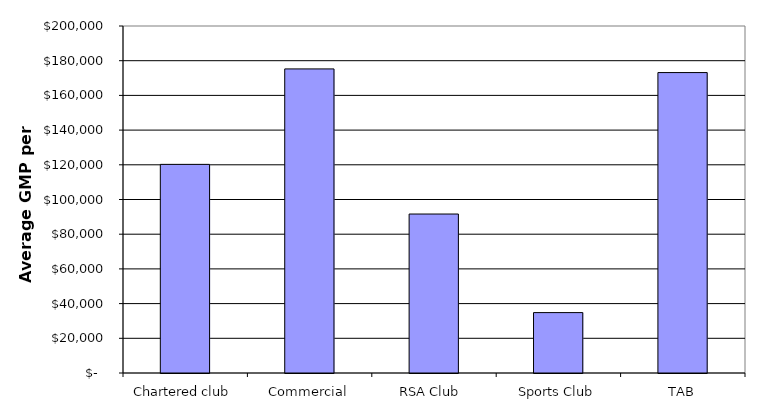
| Category | Series 0 |
|---|---|
| Chartered club | 120246.728 |
| Commercial | 175262.574 |
| RSA Club  | 91626.878 |
| Sports Club | 34807.707 |
| TAB | 173154.59 |